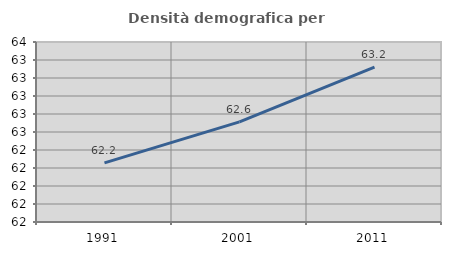
| Category | Densità demografica |
|---|---|
| 1991.0 | 62.157 |
| 2001.0 | 62.613 |
| 2011.0 | 63.221 |